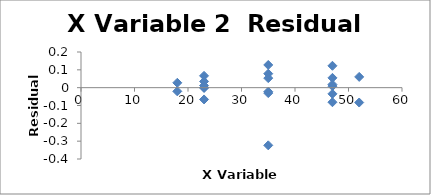
| Category | Series 0 |
|---|---|
| 18.0 | 0.027 |
| 35.0 | 0.078 |
| 52.0 | 0.06 |
| 52.0 | -0.083 |
| 18.0 | -0.021 |
| 35.0 | -0.023 |
| 35.0 | -0.03 |
| 35.0 | -0.323 |
| 23.0 | 0.012 |
| 23.0 | -0.066 |
| 47.0 | 0.055 |
| 47.0 | -0.034 |
| 47.0 | -0.082 |
| 23.0 | 0.001 |
| 23.0 | 0.035 |
| 23.0 | 0.066 |
| 23.0 | -0.002 |
| 47.0 | 0.018 |
| 47.0 | 0.009 |
| 47.0 | 0.123 |
| 35.0 | 0.127 |
| 35.0 | 0.053 |